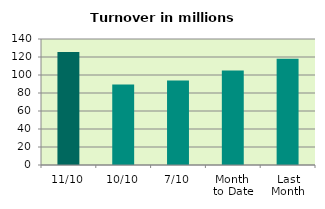
| Category | Series 0 |
|---|---|
| 11/10 | 125.444 |
| 10/10 | 89.557 |
| 7/10 | 93.858 |
| Month 
to Date | 104.882 |
| Last
Month | 117.918 |